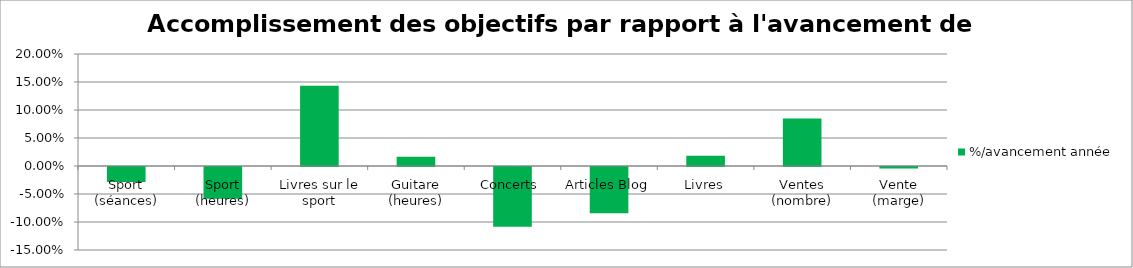
| Category | %/avancement année |
|---|---|
| Sport (séances) | -0.027 |
| Sport (heures) | -0.057 |
| Livres sur le sport | 0.143 |
| Guitare (heures) | 0.016 |
| Concerts | -0.107 |
| Articles Blog | -0.083 |
| Livres | 0.018 |
| Ventes (nombre) | 0.085 |
| Vente (marge) | -0.003 |